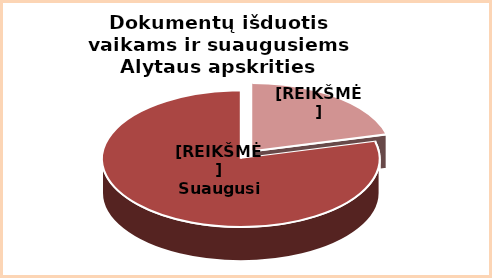
| Category | Series 0 |
|---|---|
| Vaikams | 0.21 |
| Suaugusiems | 0.79 |